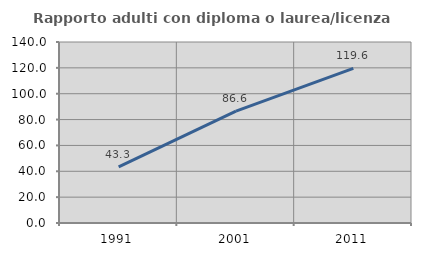
| Category | Rapporto adulti con diploma o laurea/licenza media  |
|---|---|
| 1991.0 | 43.333 |
| 2001.0 | 86.567 |
| 2011.0 | 119.595 |